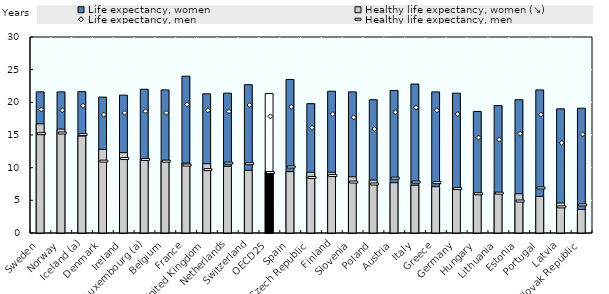
| Category | Life expectancy, women | Healthy life expectancy, women (↘) |
|---|---|---|
| Sweden | 21.6 | 16.7 |
| Norway | 21.6 | 15.9 |
| Iceland (a) | 21.633 | 14.833 |
| Denmark | 20.8 | 12.8 |
| Ireland | 21.1 | 12.3 |
| Luxembourg (a) | 22 | 11.1 |
| Belgium | 21.9 | 11 |
| France | 24 | 10.7 |
| United Kingdom | 21.3 | 10.6 |
| Netherlands | 21.4 | 10.2 |
| Switzerland | 22.7 | 9.6 |
| OECD25 | 21.345 | 9.405 |
| Spain | 23.5 | 9.4 |
| Czech Republic | 19.8 | 9.3 |
| Finland | 21.7 | 9.3 |
| Slovenia | 21.6 | 8.6 |
| Poland | 20.4 | 8.1 |
| Austria | 21.8 | 7.7 |
| Italy | 22.8 | 7.3 |
| Greece | 21.6 | 7.1 |
| Germany | 21.4 | 6.7 |
| Hungary | 18.6 | 6.1 |
| Lithuania | 19.5 | 6.1 |
| Estonia | 20.4 | 6 |
| Portugal | 21.9 | 5.6 |
| Latvia | 19 | 4.6 |
| Slovak Republic | 19.1 | 3.6 |